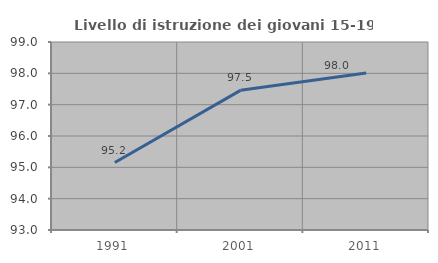
| Category | Livello di istruzione dei giovani 15-19 anni |
|---|---|
| 1991.0 | 95.153 |
| 2001.0 | 97.457 |
| 2011.0 | 98.012 |